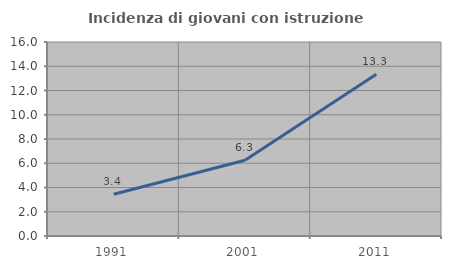
| Category | Incidenza di giovani con istruzione universitaria |
|---|---|
| 1991.0 | 3.448 |
| 2001.0 | 6.25 |
| 2011.0 | 13.333 |